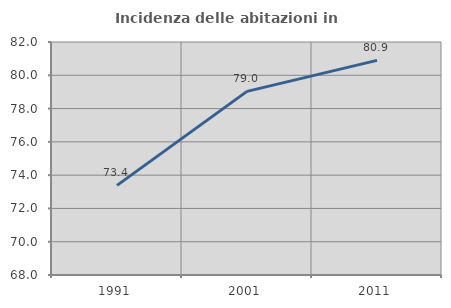
| Category | Incidenza delle abitazioni in proprietà  |
|---|---|
| 1991.0 | 73.386 |
| 2001.0 | 79.034 |
| 2011.0 | 80.895 |